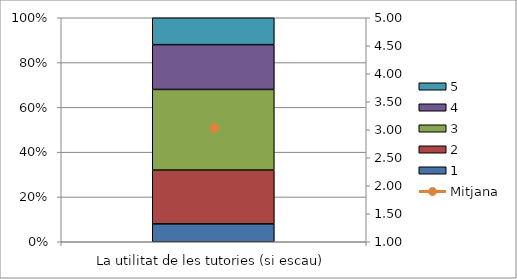
| Category | 1 | 2 | 3 | 4 | 5 |
|---|---|---|---|---|---|
| La utilitat de les tutories (si escau) | 2 | 6 | 9 | 5 | 3 |